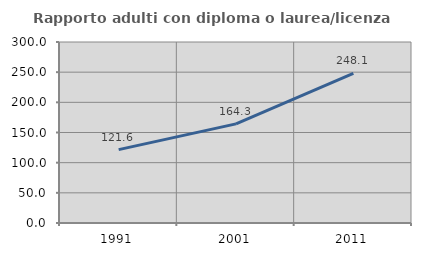
| Category | Rapporto adulti con diploma o laurea/licenza media  |
|---|---|
| 1991.0 | 121.624 |
| 2001.0 | 164.314 |
| 2011.0 | 248.104 |